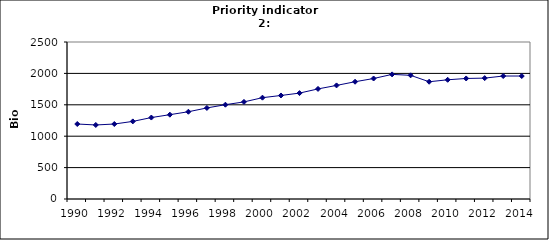
| Category | GDP, Bio Euro (EC95) |
|---|---|
| 1990 | 1194.166 |
| 1991 | 1178.732 |
| 1992 | 1193.993 |
| 1993 | 1235.669 |
| 1994 | 1296.877 |
| 1995 | 1342.701 |
| 1996 | 1389.579 |
| 1997 | 1450.031 |
| 1998 | 1501.754 |
| 1999 | 1545.881 |
| 2000 | 1613.317 |
| 2001 | 1648.566 |
| 2002 | 1686.404 |
| 2003 | 1752.999 |
| 2004 | 1808.624 |
| 2005 | 1867.129 |
| 2006 | 1918.569 |
| 2007 | 1984.323 |
| 2008 | 1969.054 |
| 2009 | 1867.246 |
| 2010 | 1898.237 |
| 2011 | 1919.448 |
| 2012 | 1924.779 |
| 2013 | 1958.337 |
| 2014 | 1958.337 |